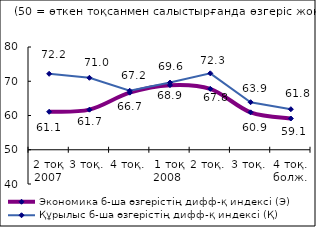
| Category | Экономика б-ша өзгерістің дифф-қ индексі (Э) | Құрылыс б-ша өзгерістің дифф-қ индексі (Қ) |
|---|---|---|
| 2 тоқ 2007 | 61.09 | 72.175 |
| 3 тоқ. | 61.7 | 71.01 |
| 4 тоқ. | 66.665 | 67.23 |
| 1 тоқ 2008  | 68.865 | 69.62 |
| 2 тоқ. | 67.78 | 72.315 |
| 3 тоқ. | 60.925 | 63.885 |
| 4 тоқ. болж. | 59.12 | 61.835 |